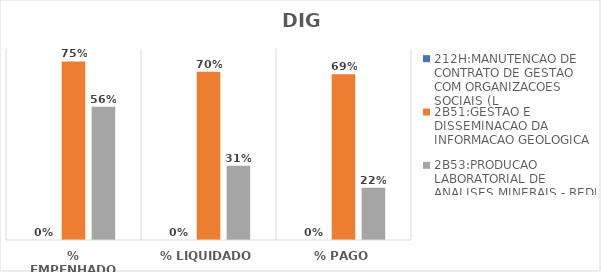
| Category | 212H:MANUTENCAO DE CONTRATO DE GESTAO COM ORGANIZACOES SOCIAIS (L | 2B51:GESTAO E DISSEMINACAO DA INFORMACAO GEOLOGICA | 2B53:PRODUCAO LABORATORIAL DE ANALISES MINERAIS - REDE LAMIN |
|---|---|---|---|
| % EMPENHADO | 0 | 0.748 | 0.558 |
| % LIQUIDADO | 0 | 0.705 | 0.311 |
| % PAGO | 0 | 0.694 | 0.219 |